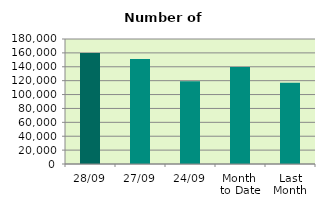
| Category | Series 0 |
|---|---|
| 28/09 | 159662 |
| 27/09 | 151376 |
| 24/09 | 119254 |
| Month 
to Date | 139501.4 |
| Last
Month | 117090.273 |